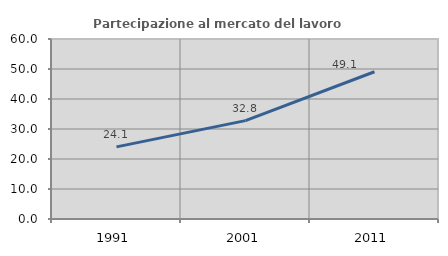
| Category | Partecipazione al mercato del lavoro  femminile |
|---|---|
| 1991.0 | 24.051 |
| 2001.0 | 32.787 |
| 2011.0 | 49.091 |